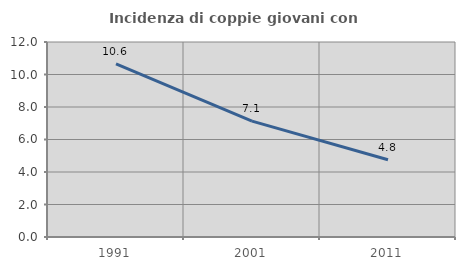
| Category | Incidenza di coppie giovani con figli |
|---|---|
| 1991.0 | 10.648 |
| 2001.0 | 7.127 |
| 2011.0 | 4.752 |